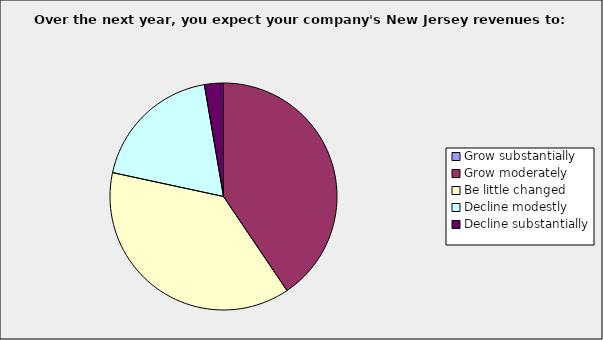
| Category | Series 0 |
|---|---|
| Grow substantially | 0 |
| Grow moderately | 0.405 |
| Be little changed | 0.378 |
| Decline modestly | 0.189 |
| Decline substantially | 0.027 |